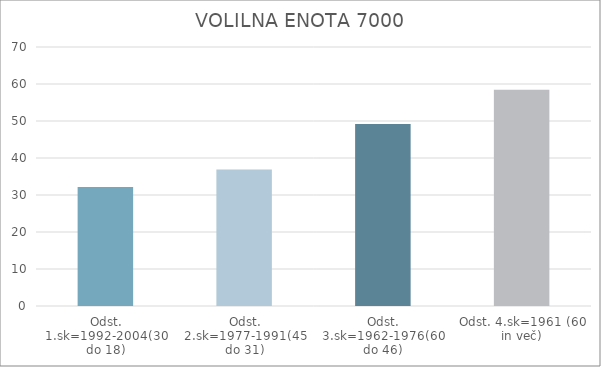
| Category | Series 0 |
|---|---|
| Odst. 1.sk=1992-2004(30 do 18) | 32.19 |
| Odst. 2.sk=1977-1991(45 do 31) | 36.89 |
| Odst. 3.sk=1962-1976(60 do 46) | 49.19 |
| Odst. 4.sk=1961 (60 in več) | 58.47 |